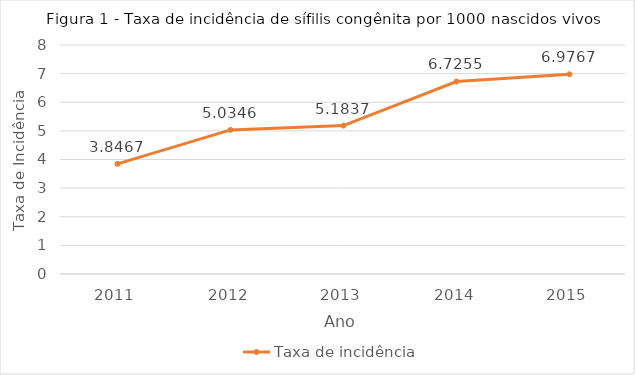
| Category | Taxa de incidência |
|---|---|
| 2011.0 | 3.847 |
| 2012.0 | 5.035 |
| 2013.0 | 5.184 |
| 2014.0 | 6.726 |
| 2015.0 | 6.977 |